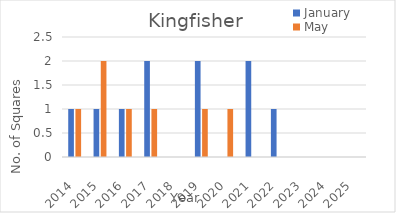
| Category | January | May |
|---|---|---|
| 2014.0 | 1 | 1 |
| 2015.0 | 1 | 2 |
| 2016.0 | 1 | 1 |
| 2017.0 | 2 | 1 |
| 2018.0 | 0 | 0 |
| 2019.0 | 2 | 1 |
| 2020.0 | 0 | 1 |
| 2021.0 | 2 | 0 |
| 2022.0 | 1 | 0 |
| 2023.0 | 0 | 0 |
| 2024.0 | 0 | 0 |
| 2025.0 | 0 | 0 |